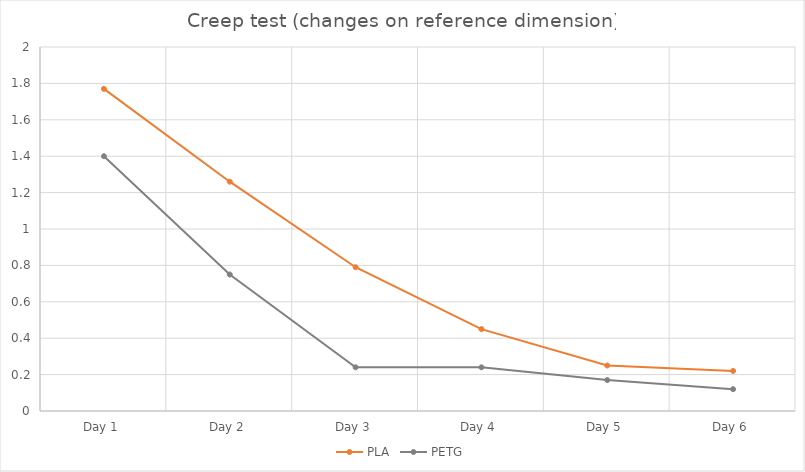
| Category | PLA | PETG |
|---|---|---|
| Day 1 | 1.77 | 1.4 |
| Day 2 | 1.26 | 0.75 |
| Day 3 | 0.79 | 0.24 |
| Day 4 | 0.45 | 0.24 |
| Day 5 | 0.25 | 0.17 |
| Day 6 | 0.22 | 0.12 |